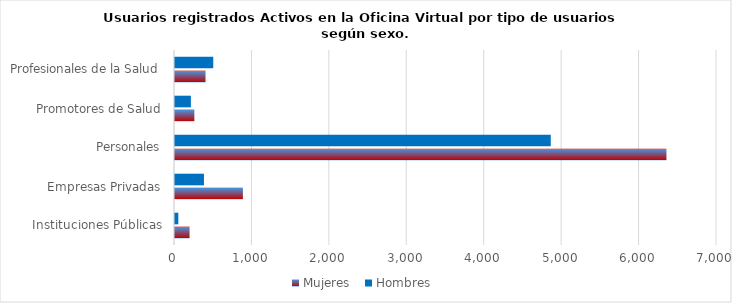
| Category | Mujeres | Hombres |
|---|---|---|
| Instituciones Públicas | 188 | 43 |
| Empresas Privadas | 877 | 374 |
| Personales | 6347 | 4853 |
| Promotores de Salud | 250 | 205 |
| Profesionales de la Salud | 394 | 494 |